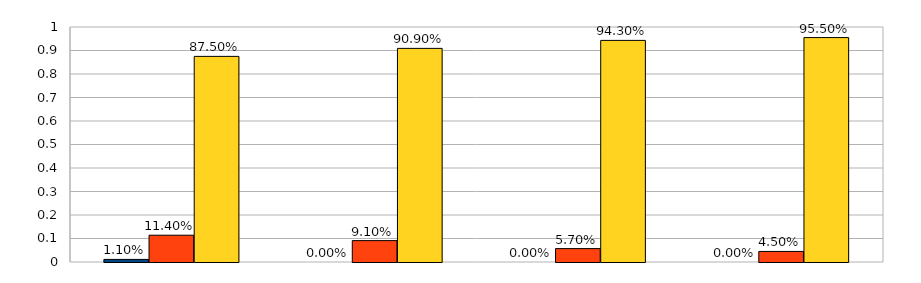
| Category | Series 0 | Series 1 | Series 2 |
|---|---|---|---|
| 0 | 0.011 | 0.114 | 0.875 |
| 1 | 0 | 0.091 | 0.909 |
| 2 | 0 | 0.057 | 0.943 |
| 3 | 0 | 0.045 | 0.955 |